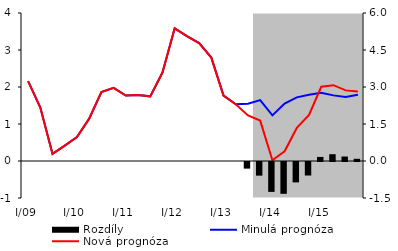
| Category | Rozdíly |
|---|---|
| 0 | 0 |
| 1 | 0 |
| 2 | 0 |
| 3 | 0 |
| 4 | 0 |
| 5 | 0 |
| 6 | 0 |
| 7 | 0 |
| 8 | 0 |
| 9 | 0 |
| 10 | 0 |
| 11 | 0 |
| 12 | 0 |
| 13 | 0 |
| 14 | 0 |
| 15 | 0 |
| 16 | 0 |
| 17 | 0 |
| 18 | -0.268 |
| 19 | -0.553 |
| 20 | -1.212 |
| 21 | -1.29 |
| 22 | -0.827 |
| 23 | -0.548 |
| 24 | 0.165 |
| 25 | 0.275 |
| 26 | 0.181 |
| 27 | 0.089 |